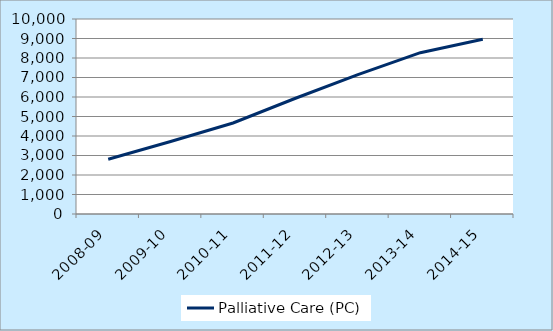
| Category | Palliative Care (PC) |
|---|---|
| 2008-09 | 2810 |
| 2009-10 | 3719 |
| 2010-11 | 4668 |
| 2011-12 | 5935 |
| 2012-13 | 7152 |
| 2013-14 | 8272 |
| 2014-15 | 8962 |